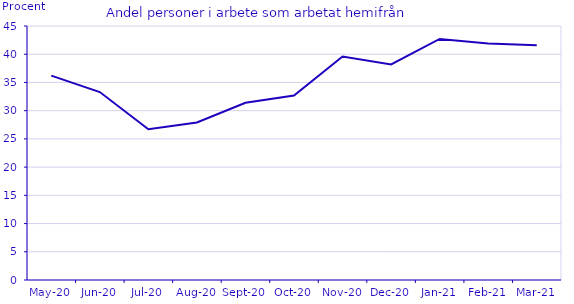
| Category | Series 0 |
|---|---|
| 2020-05-01 | 36.2 |
| 2020-06-01 | 33.3 |
| 2020-07-01 | 26.7 |
| 2020-08-01 | 27.9 |
| 2020-09-01 | 31.4 |
| 2020-10-01 | 32.7 |
| 2020-11-01 | 39.6 |
| 2020-12-01 | 38.2 |
| 2021-01-01 | 42.7 |
| 2021-02-01 | 41.9 |
| 2021-03-01 | 41.6 |